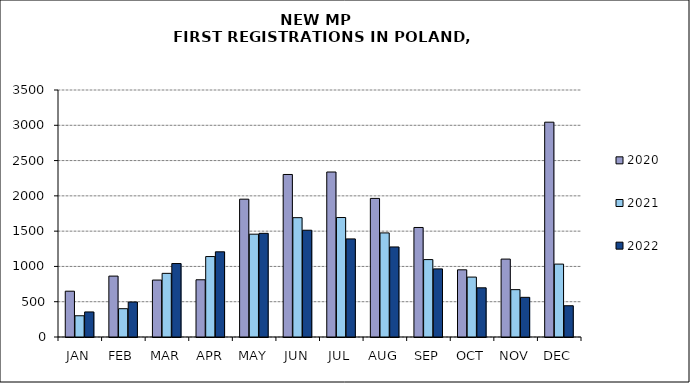
| Category | 2020 | 2021 | 2022 |
|---|---|---|---|
|  JAN  | 649 | 301 | 355 |
|  FEB  | 863 | 401 | 496 |
| MAR | 807 | 902 | 1041 |
| APR | 811 | 1140 | 1207 |
| MAY | 1953 | 1457 | 1469 |
| JUN | 2303 | 1691 | 1513 |
| JUL | 2338 | 1693 | 1390 |
| AUG | 1964 | 1475 | 1276 |
| SEP | 1552 | 1097 | 965 |
| OCT | 952 | 849 | 697 |
| NOV | 1104 | 671 | 562 |
| DEC | 3044 | 1033 | 443 |